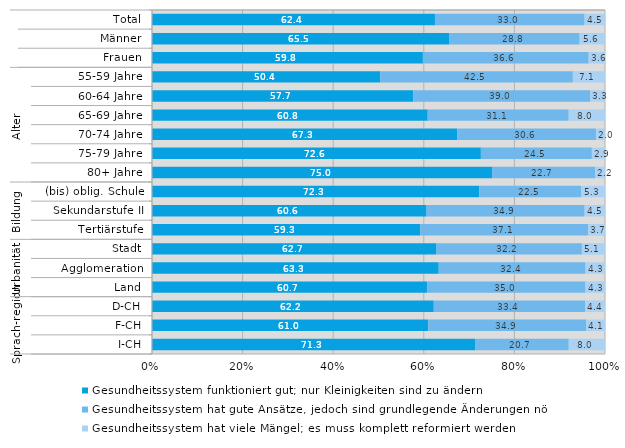
| Category | Gesundheitssystem funktioniert gut; nur Kleinigkeiten sind zu ändern | Gesundheitssystem hat gute Ansätze, jedoch sind grundlegende Änderungen nötig | Gesundheitssystem hat viele Mängel; es muss komplett reformiert werden |
|---|---|---|---|
| 0 | 62.4 | 33 | 4.5 |
| 1 | 65.5 | 28.8 | 5.6 |
| 2 | 59.8 | 36.6 | 3.6 |
| 3 | 50.4 | 42.5 | 7.1 |
| 4 | 57.7 | 39 | 3.3 |
| 5 | 60.8 | 31.1 | 8 |
| 6 | 67.3 | 30.6 | 2 |
| 7 | 72.6 | 24.5 | 2.9 |
| 8 | 75 | 22.7 | 2.2 |
| 9 | 72.3 | 22.5 | 5.3 |
| 10 | 60.6 | 34.9 | 4.5 |
| 11 | 59.3 | 37.1 | 3.7 |
| 12 | 62.7 | 32.2 | 5.1 |
| 13 | 63.3 | 32.4 | 4.3 |
| 14 | 60.7 | 35 | 4.3 |
| 15 | 62.2 | 33.4 | 4.4 |
| 16 | 61 | 34.9 | 4.1 |
| 17 | 71.3 | 20.7 | 8 |